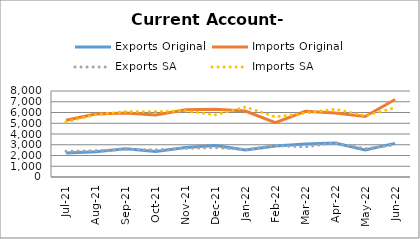
| Category | Exports Original | Imports Original | Exports SA | Imports SA |
|---|---|---|---|---|
| 2021-07-11 | 2234 | 5278 | 2387 | 5128 |
| 2021-08-11 | 2339 | 5869 | 2453 | 5799 |
| 2021-09-11 | 2627 | 5951 | 2561 | 6076 |
| 2021-10-11 | 2375 | 5776 | 2530 | 6095 |
| 2021-11-11 | 2737 | 6252 | 2659 | 6149 |
| 2021-12-11 | 2930 | 6310 | 2735 | 5785 |
| 2022-01-11 | 2503 | 6130 | 2552 | 6514 |
| 2022-02-11 | 2890 | 5066 | 2912 | 5594 |
| 2022-03-11 | 3071 | 6114 | 2803 | 5943 |
| 2022-04-11 | 3152 | 5959 | 3184 | 6305 |
| 2022-05-11 | 2505 | 5634 | 2641 | 5695 |
| 2022-06-11 | 3130 | 7204 | 2995 | 6444 |